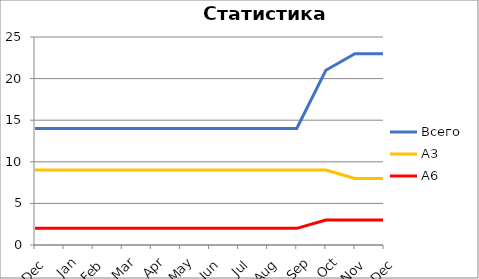
| Category | Всего | А3 | A6 |
|---|---|---|---|
| 0 | 14 | 9 | 2 |
| 1 | 14 | 9 | 2 |
| 2 | 14 | 9 | 2 |
| 3 | 14 | 9 | 2 |
| 4 | 14 | 9 | 2 |
| 5 | 14 | 9 | 2 |
| 6 | 14 | 9 | 2 |
| 7 | 14 | 9 | 2 |
| 8 | 14 | 9 | 2 |
| 9 | 14 | 9 | 2 |
| 10 | 21 | 9 | 3 |
| 11 | 23 | 8 | 3 |
| 12 | 23 | 8 | 3 |